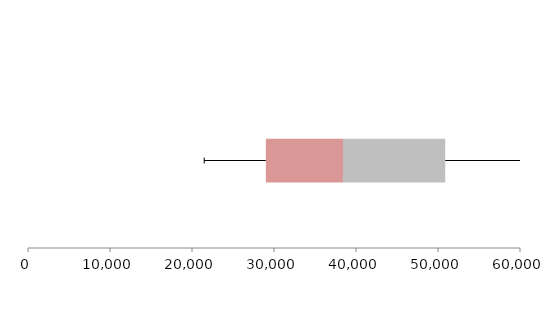
| Category | Series 1 | Series 2 | Series 3 |
|---|---|---|---|
| 0 | 29006.773 | 9405.496 | 12469.865 |